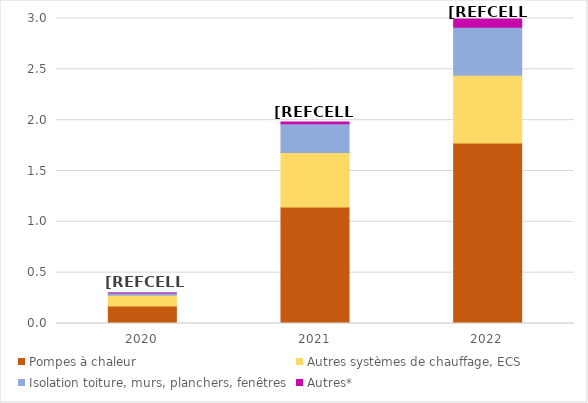
| Category | Pompes à chaleur | Autres systèmes de chauffage, ECS | Isolation toiture, murs, planchers, fenêtres | Autres* |
|---|---|---|---|---|
| 2020.0 | 0.172 | 0.106 | 0.021 | 0.001 |
| 2021.0 | 1.146 | 0.537 | 0.281 | 0.019 |
| 2022.0 | 1.775 | 0.666 | 0.472 | 0.081 |